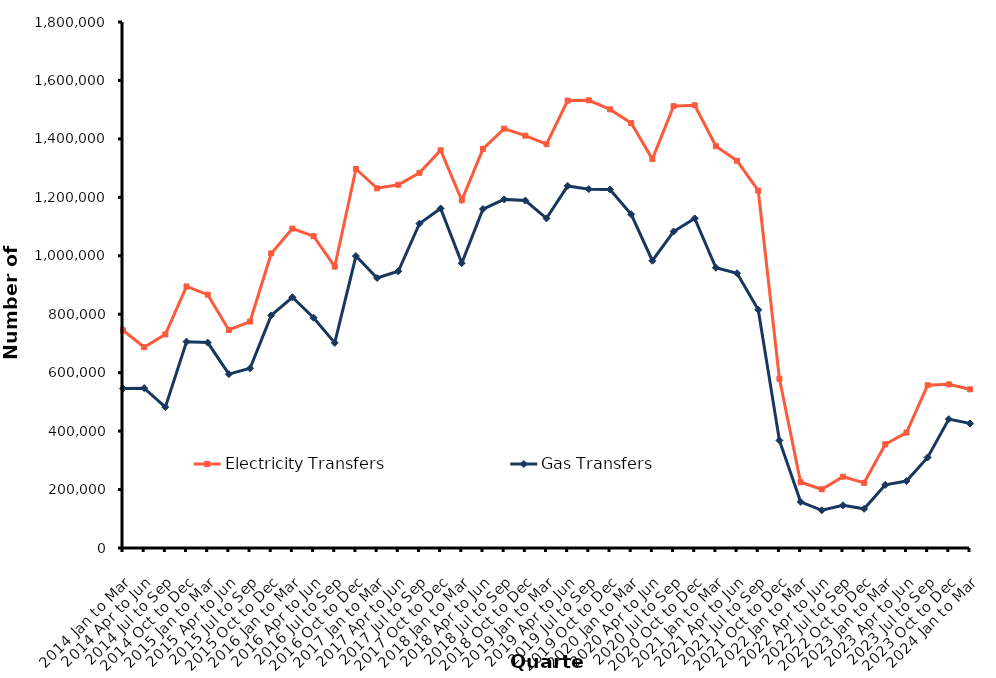
| Category | Electricity Transfers | Gas Transfers |
|---|---|---|
| 2014 Jan to Mar | 745000 | 546000 |
| 2014 Apr to Jun | 687000 | 547000 |
| 2014 Jul to Sep | 731000 | 482000 |
| 2014 Oct to Dec | 895000 | 706000 |
| 2015 Jan to Mar | 867000 | 703000 |
| 2015 Apr to Jun | 746000 | 595000 |
| 2015 Jul to Sep | 775000 | 615000 |
| 2015 Oct to Dec | 1008000 | 796000 |
| 2016 Jan to Mar | 1093000 | 858000 |
| 2016 Apr to Jun | 1067000 | 788000 |
| 2016 Jul to Sep | 963000 | 702000 |
| 2016 Oct to Dec | 1297000 | 999000 |
| 2017 Jan to Mar | 1231000 | 924000 |
| 2017 Apr to Jun | 1243000 | 947000 |
| 2017 Jul to Sep | 1284000 | 1110000 |
| 2017 Oct to Dec | 1361000 | 1162000 |
| 2018 Jan to Mar | 1190000 | 975000 |
| 2018 Apr to Jun | 1366000 | 1160000 |
| 2018 Jul to Sep | 1435000 | 1193000 |
| 2018 Oct to Dec | 1411000 | 1189000 |
| 2019 Jan to Mar | 1382000 | 1128000 |
| 2019 Apr to Jun | 1531000 | 1239000 |
| 2019 Jul to Sep | 1532000 | 1228000 |
| 2019 Oct to Dec | 1501000 | 1227000 |
| 2020 Jan to Mar | 1454000 | 1142000 |
| 2020 Apr to Jun | 1331000 | 983000 |
| 2020 Jul to Sep | 1512000 | 1083000 |
| 2020 Oct to Dec | 1515000 | 1128000 |
| 2021 Jan to Mar | 1375000 | 959000 |
| 2021 Apr to Jun | 1325000 | 940000 |
| 2021 Jul to Sep | 1223000 | 815000 |
| 2021 Oct to Dec | 579000 | 368000 |
| 2022 Jan to Mar | 225000 | 158000 |
| 2022 Apr to Jun | 201000 | 129000 |
| 2022 Jul to Sep | 244000 | 146000 |
| 2022 Oct to Dec | 223000 | 134000 |
| 2023 Jan to Mar | 355000 | 216000 |
| 2023 Apr to Jun | 395000 | 229000 |
| 2023 Jul to Sep | 557000 | 310000 |
| 2023 Oct to Dec | 560000 | 441000 |
| 2024 Jan to Mar | 543000 | 426000 |